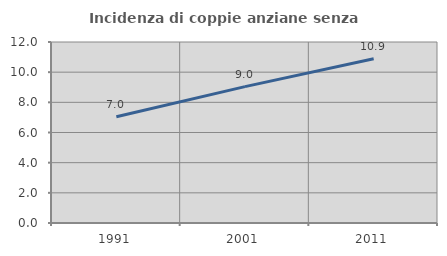
| Category | Incidenza di coppie anziane senza figli  |
|---|---|
| 1991.0 | 7.042 |
| 2001.0 | 9.043 |
| 2011.0 | 10.884 |